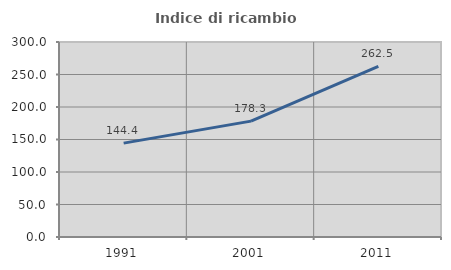
| Category | Indice di ricambio occupazionale  |
|---|---|
| 1991.0 | 144.444 |
| 2001.0 | 178.261 |
| 2011.0 | 262.5 |